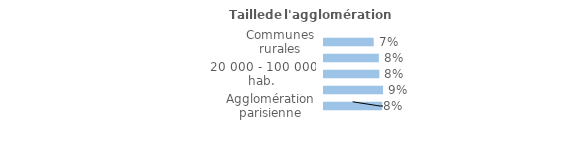
| Category | Series 0 |
|---|---|
| Communes rurales | 0.072 |
| moins de 20 000 hab. | 0.08 |
| 20 000 - 100 000 hab. | 0.081 |
| 100 000 hab. ou plus | 0.086 |
| Agglomération parisienne | 0.085 |